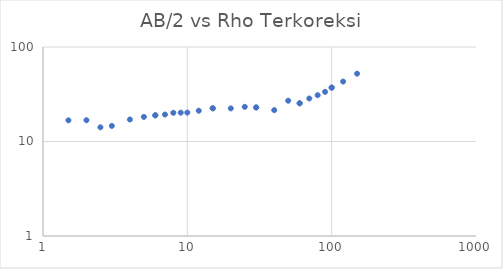
| Category | Series 0 |
|---|---|
| 1.5 | 16.75 |
| 2.0 | 16.801 |
| 2.5 | 14.13 |
| 3.0 | 14.622 |
| 4.0 | 17.097 |
| 5.0 | 18.211 |
| 6.0 | 18.933 |
| 6.0 | 18.933 |
| 7.0 | 19.294 |
| 8.0 | 20.123 |
| 9.0 | 20.191 |
| 10.0 | 20.231 |
| 12.0 | 21.171 |
| 15.0 | 22.47 |
| 15.0 | 22.47 |
| 20.0 | 22.402 |
| 25.0 | 23.272 |
| 30.0 | 22.926 |
| 30.0 | 22.926 |
| 40.0 | 21.481 |
| 50.0 | 27.012 |
| 60.0 | 25.361 |
| 60.0 | 25.361 |
| 70.0 | 28.526 |
| 80.0 | 30.91 |
| 90.0 | 33.544 |
| 100.0 | 37.175 |
| 100.0 | 37.175 |
| 120.0 | 43.054 |
| 150.0 | 52.199 |